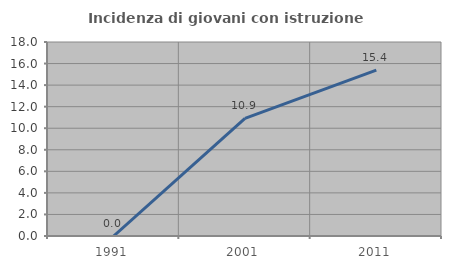
| Category | Incidenza di giovani con istruzione universitaria |
|---|---|
| 1991.0 | 0 |
| 2001.0 | 10.909 |
| 2011.0 | 15.385 |